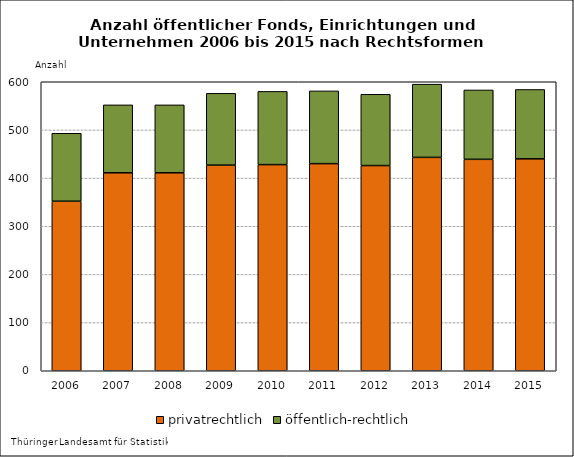
| Category | privatrechtlich | öffentlich-rechtlich |
|---|---|---|
| 2006.0 | 352 | 141 |
| 2007.0 | 411 | 141 |
| 2008.0 | 411 | 141 |
| 2009.0 | 427 | 149 |
| 2010.0 | 428 | 152 |
| 2011.0 | 430 | 151 |
| 2012.0 | 426 | 148 |
| 2013.0 | 443 | 152 |
| 2014.0 | 439 | 144 |
| 2015.0 | 440 | 144 |